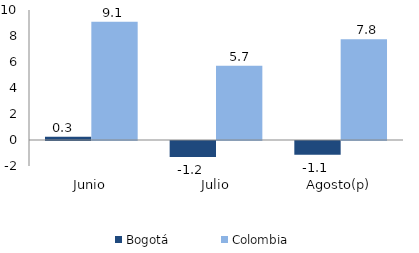
| Category | Bogotá | Colombia |
|---|---|---|
| Junio | 0.252 | 9.095 |
| Julio | -1.24 | 5.712 |
| Agosto(p) | -1.065 | 7.758 |